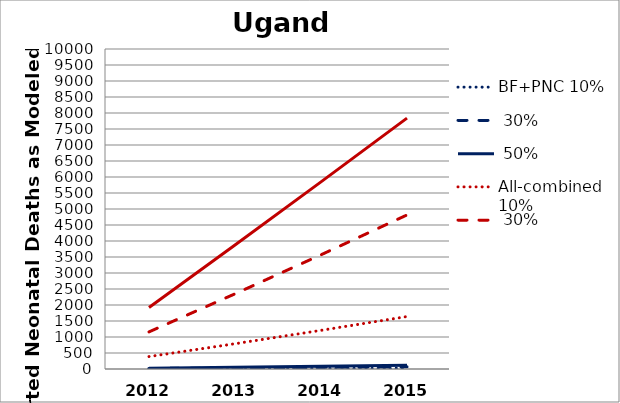
| Category | BF+PNC 10% | BF+PNC 30% | BF+PNC 50% | All-combined 10% | All-combined 30% | All-combined 50% |
|---|---|---|---|---|---|---|
| 2012.0 | 5 | 16 | 27 | 388 | 1160 | 1924 |
| 2013.0 | 11 | 32 | 56 | 790 | 2349 | 3874 |
| 2014.0 | 18 | 50 | 86 | 1208 | 3569 | 5847 |
| 2015.0 | 24 | 68 | 118 | 1639 | 4814 | 7839 |